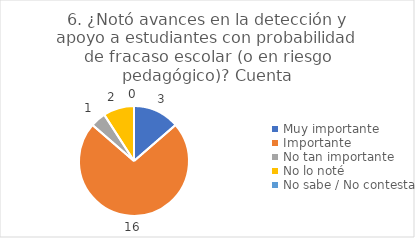
| Category | 6. ¿Notó avances en la detección y apoyo a estudiantes con probabilidad de fracaso escolar (o en riesgo pedagógico)? |
|---|---|
| Muy importante  | 0.136 |
| Importante  | 0.727 |
| No tan importante  | 0.045 |
| No lo noté  | 0.091 |
| No sabe / No contesta | 0 |